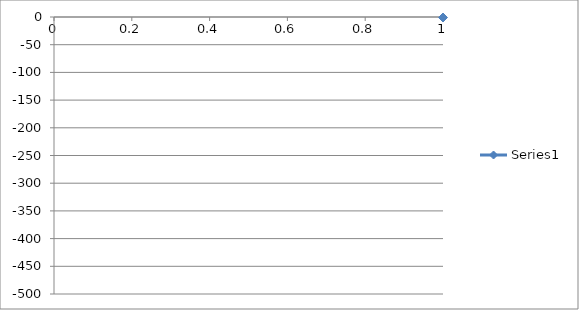
| Category | Series 0 |
|---|---|
| 0 | -0.952 |
| 1 | -1.057 |
| 2 | -1.136 |
| 3 | -1.202 |
| 4 | -1.282 |
| 5 | -1.368 |
| 6 | -1.476 |
| 7 | -1.577 |
| 8 | -1.704 |
| 9 | -1.836 |
| 10 | -1.978 |
| 11 | -2.147 |
| 12 | -2.317 |
| 13 | -2.554 |
| 14 | -2.781 |
| 15 | -3.027 |
| 16 | -3.331 |
| 17 | -3.675 |
| 18 | -4.081 |
| 19 | -4.62 |
| 20 | -5.082 |
| 21 | -5.733 |
| 22 | -6.528 |
| 23 | -7.938 |
| 24 | -8.667 |
| 25 | -10.43 |
| 26 | -12.153 |
| 27 | -14.706 |
| 28 | -17.562 |
| 29 | -21.342 |
| 30 | -26.202 |
| 31 | -28.843 |
| 32 | -31.355 |
| 33 | -34.102 |
| 34 | -37.705 |
| 35 | -41.094 |
| 36 | -45.378 |
| 37 | -49.505 |
| 38 | -54.909 |
| 39 | -60.524 |
| 40 | -66.987 |
| 41 | -74.269 |
| 42 | -81.79 |
| 43 | -90.956 |
| 44 | -101.159 |
| 45 | -111.416 |
| 46 | -123.691 |
| 47 | -136.794 |
| 48 | -150.748 |
| 49 | -165.72 |
| 50 | -181.502 |
| 51 | -198.88 |
| 52 | -216.646 |
| 53 | -234.565 |
| 54 | -252.816 |
| 55 | -271.742 |
| 56 | -290.395 |
| 57 | -308.584 |
| 58 | -325.923 |
| 59 | -343.554 |
| 60 | -359.444 |
| 61 | -374.721 |
| 62 | -388.278 |
| 63 | -401.385 |
| 64 | -412.709 |
| 65 | -422.797 |
| 66 | -431.41 |
| 67 | -439.329 |
| 68 | -446.433 |
| 69 | -451.482 |
| 70 | -456.636 |
| 71 | -460.443 |
| 72 | -463.09 |
| 73 | -465.648 |
| 74 | -467.113 |
| 75 | -468.429 |
| 76 | -468.974 |
| 77 | -469.585 |
| 78 | -470.055 |
| 79 | -470.387 |
| 80 | -470.583 |
| 81 | -470.661 |
| 82 | -470.635 |
| 83 | -470.488 |
| 84 | -470.137 |
| 85 | -469.55 |
| 86 | -468.044 |
| 87 | -466.444 |
| 88 | -464.006 |
| 89 | -461.224 |
| 90 | -457.381 |
| 91 | -453.121 |
| 92 | -447.338 |
| 93 | -440.623 |
| 94 | -432.781 |
| 95 | -423.263 |
| 96 | -413.292 |
| 97 | -401.44 |
| 98 | -388.644 |
| 99 | -374.366 |
| 100 | -359.419 |
| 101 | -342.878 |
| 102 | -325.775 |
| 103 | -307.751 |
| 104 | -289.261 |
| 105 | -270.699 |
| 106 | -252.201 |
| 107 | -233.38 |
| 108 | -215.123 |
| 109 | -197.661 |
| 110 | -180.652 |
| 111 | -164.592 |
| 112 | -149.502 |
| 113 | -135.482 |
| 114 | -123.17 |
| 115 | -111.012 |
| 116 | -100.505 |
| 117 | -90.976 |
| 118 | -82.119 |
| 119 | -74.345 |
| 120 | -66.678 |
| 121 | -60.317 |
| 122 | -54.922 |
| 123 | -49.718 |
| 124 | -45.4 |
| 125 | -41.279 |
| 126 | -37.577 |
| 127 | -34.624 |
| 128 | -31.785 |
| 129 | -28.939 |
| 130 | -26.407 |
| 131 | -21.607 |
| 132 | -17.933 |
| 133 | -15.09 |
| 134 | -12.501 |
| 135 | -10.833 |
| 136 | -9.263 |
| 137 | -7.897 |
| 138 | -7.239 |
| 139 | -6.455 |
| 140 | -5.677 |
| 141 | -5.03 |
| 142 | -4.461 |
| 143 | -3.988 |
| 144 | -3.572 |
| 145 | -3.19 |
| 146 | -2.882 |
| 147 | -2.597 |
| 148 | -2.374 |
| 149 | -2.134 |
| 150 | -1.936 |
| 151 | -1.769 |
| 152 | -1.623 |
| 153 | -1.5 |
| 154 | -1.375 |
| 155 | -1.237 |
| 156 | -1.136 |
| 157 | -1.036 |
| 158 | -0.945 |
| 159 | -0.858 |
| 160 | -0.787 |